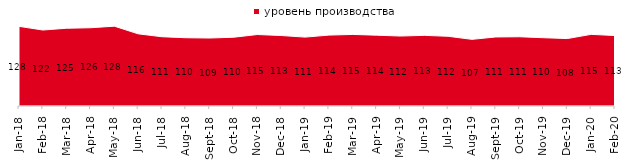
| Category | уровень производства |
|---|---|
| 2018-01-01 | 127.8 |
| 2018-02-01 | 121.95 |
| 2018-03-01 | 124.8 |
| 2018-04-01 | 125.6 |
| 2018-05-01 | 128.1 |
| 2018-06-01 | 115.8 |
| 2018-07-01 | 111.15 |
| 2018-08-01 | 109.55 |
| 2018-09-01 | 109.1 |
| 2018-10-01 | 110.35 |
| 2018-11-01 | 114.721 |
| 2018-12-01 | 113.1 |
| 2019-01-01 | 110.55 |
| 2019-02-01 | 113.8 |
| 2019-03-01 | 114.868 |
| 2019-04-01 | 113.663 |
| 2019-05-01 | 112.283 |
| 2019-06-01 | 113.367 |
| 2019-07-01 | 111.881 |
| 2019-08-01 | 106.943 |
| 2019-09-01 | 110.792 |
| 2019-10-01 | 111.139 |
| 2019-11-01 | 109.604 |
| 2019-12-01 | 108.218 |
| 2020-01-01 | 115 |
| 2020-02-01 | 113.069 |